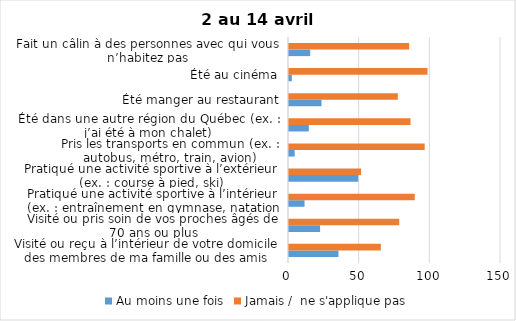
| Category | Au moins une fois | Jamais /  ne s'applique pas |
|---|---|---|
| Visité ou reçu à l’intérieur de votre domicile des membres de ma famille ou des amis | 35 | 65 |
| Visité ou pris soin de vos proches âgés de 70 ans ou plus | 22 | 78 |
| Pratiqué une activité sportive à l’intérieur (ex. : entraînement en gymnase, natation en piscine) | 11 | 89 |
| Pratiqué une activité sportive à l’extérieur (ex. : course à pied, ski) | 49 | 51 |
| Pris les transports en commun (ex. : autobus, métro, train, avion) | 4 | 96 |
| Été dans une autre région du Québec (ex. : j’ai été à mon chalet) | 14 | 86 |
| Été manger au restaurant | 23 | 77 |
| Été au cinéma | 2 | 98 |
| Fait un câlin à des personnes avec qui vous n’habitez pas | 15 | 85 |